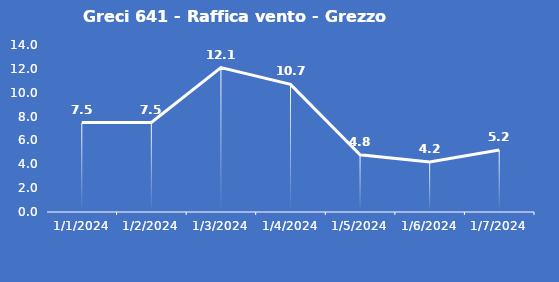
| Category | Greci 641 - Raffica vento - Grezzo (m/s) |
|---|---|
| 1/1/24 | 7.5 |
| 1/2/24 | 7.5 |
| 1/3/24 | 12.1 |
| 1/4/24 | 10.7 |
| 1/5/24 | 4.8 |
| 1/6/24 | 4.2 |
| 1/7/24 | 5.2 |